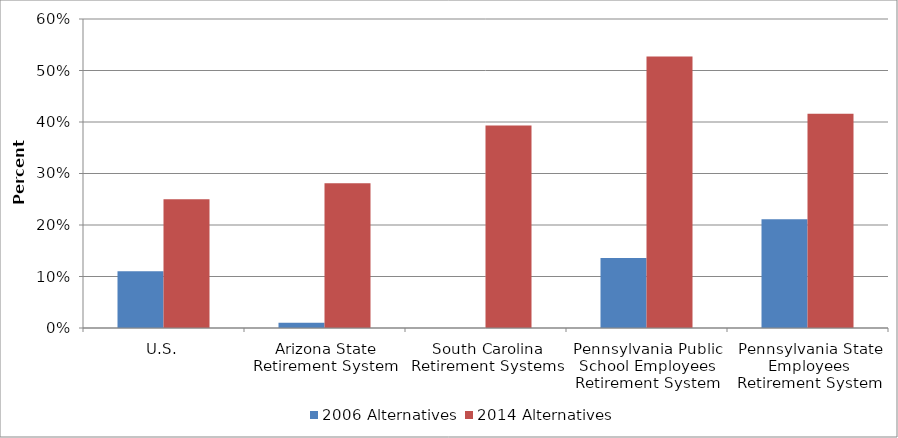
| Category | 2006 Alternatives | 2014 Alternatives |
|---|---|---|
| U.S. | 0.11 | 0.25 |
| Arizona State Retirement System | 0.01 | 0.281 |
| South Carolina Retirement Systems | 0 | 0.393 |
| Pennsylvania Public School Employees Retirement System | 0.136 | 0.527 |
| Pennsylvania State Employees Retirement System | 0.211 | 0.416 |